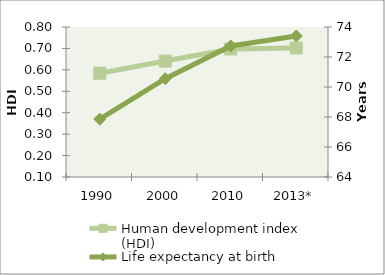
| Category | Human development index (HDI) |
|---|---|
| 1990 | 0.584 |
| 2000 | 0.641 |
| 2010 | 0.697 |
| 2013* | 0.702 |